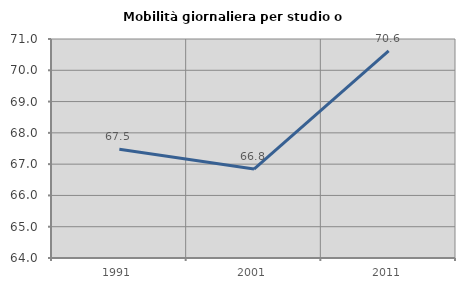
| Category | Mobilità giornaliera per studio o lavoro |
|---|---|
| 1991.0 | 67.476 |
| 2001.0 | 66.843 |
| 2011.0 | 70.618 |